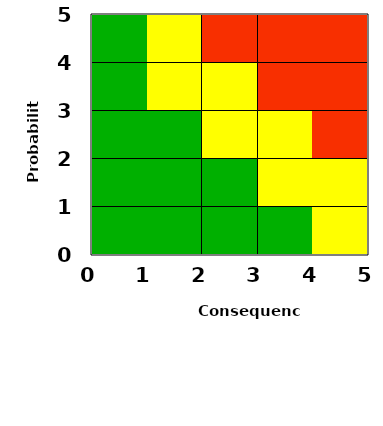
| Category | Series 0 |
|---|---|
| 2.5 | 0 |